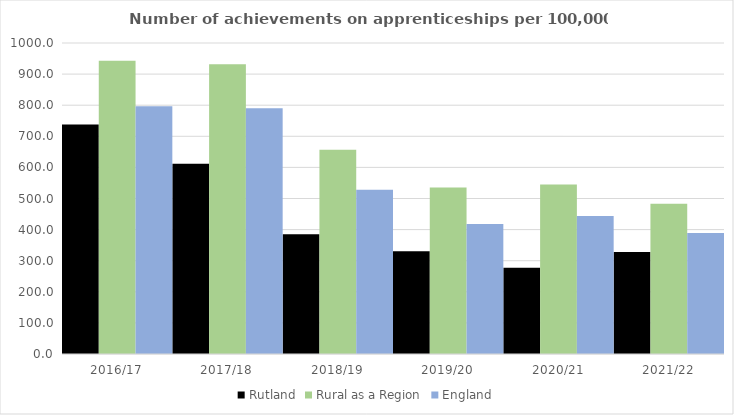
| Category | Rutland | Rural as a Region | England |
|---|---|---|---|
| 2016/17 | 738 | 942.594 | 797 |
| 2017/18 | 612 | 931.709 | 790 |
| 2018/19 | 385 | 656.44 | 528 |
| 2019/20 | 330 | 535.552 | 418 |
| 2020/21 | 277 | 545.333 | 444 |
| 2021/22 | 328 | 482.936 | 389 |